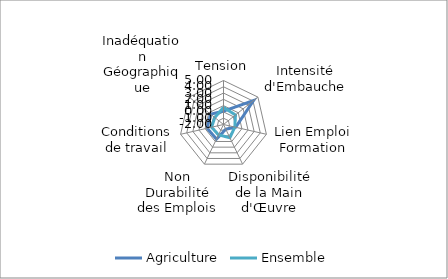
| Category | Agriculture | Ensemble |
|---|---|---|
| Tension | 0.127 | 0.728 |
| Intensité d'Embauche | 4.114 | 0.434 |
| Lien Emploi Formation | -0.019 | -0.153 |
| Disponibilité de la Main d'Œuvre | -1.171 | 0.338 |
| Non Durabilité des Emplois | 0.579 | -0.177 |
| Conditions de travail | 0.667 | -0.058 |
| Inadéquation Géographique | 0.619 | -0.228 |